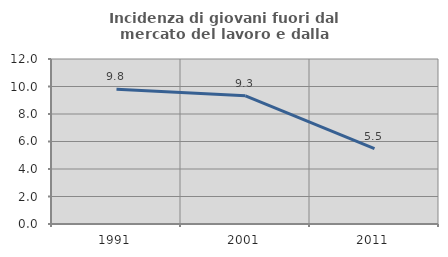
| Category | Incidenza di giovani fuori dal mercato del lavoro e dalla formazione  |
|---|---|
| 1991.0 | 9.804 |
| 2001.0 | 9.322 |
| 2011.0 | 5.479 |